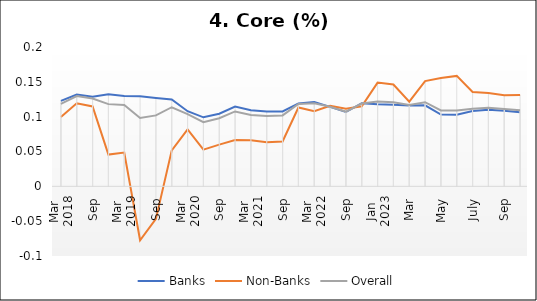
| Category | Banks | Non-Banks | Overall |
|---|---|---|---|
| 0 | 0.123 | 0.099 | 0.118 |
| 1 | 0.132 | 0.119 | 0.13 |
| 2 | 0.128 | 0.115 | 0.126 |
| 3 | 0.132 | 0.046 | 0.118 |
| 4 | 0.13 | 0.048 | 0.117 |
| 5 | 0.129 | -0.077 | 0.098 |
| 6 | 0.127 | -0.047 | 0.102 |
| 7 | 0.125 | 0.052 | 0.114 |
| 8 | 0.108 | 0.082 | 0.104 |
| 9 | 0.099 | 0.053 | 0.092 |
| 10 | 0.104 | 0.06 | 0.098 |
| 11 | 0.114 | 0.066 | 0.108 |
| 12 | 0.109 | 0.066 | 0.102 |
| 13 | 0.107 | 0.063 | 0.101 |
| 14 | 0.108 | 0.064 | 0.102 |
| 15 | 0.119 | 0.113 | 0.118 |
| 16 | 0.121 | 0.108 | 0.119 |
| 17 | 0.114 | 0.116 | 0.114 |
| 18 | 0.107 | 0.111 | 0.107 |
| 19 | 0.119 | 0.115 | 0.119 |
| 20 | 0.118 | 0.149 | 0.122 |
| 21 | 0.117 | 0.146 | 0.121 |
| 22 | 0.116 | 0.122 | 0.117 |
| 23 | 0.116 | 0.151 | 0.121 |
| 24 | 0.103 | 0.156 | 0.109 |
| 25 | 0.103 | 0.159 | 0.109 |
| 26 | 0.108 | 0.135 | 0.111 |
| 27 | 0.11 | 0.134 | 0.113 |
| 28 | 0.108 | 0.131 | 0.111 |
| 29 | 0.106 | 0.131 | 0.109 |